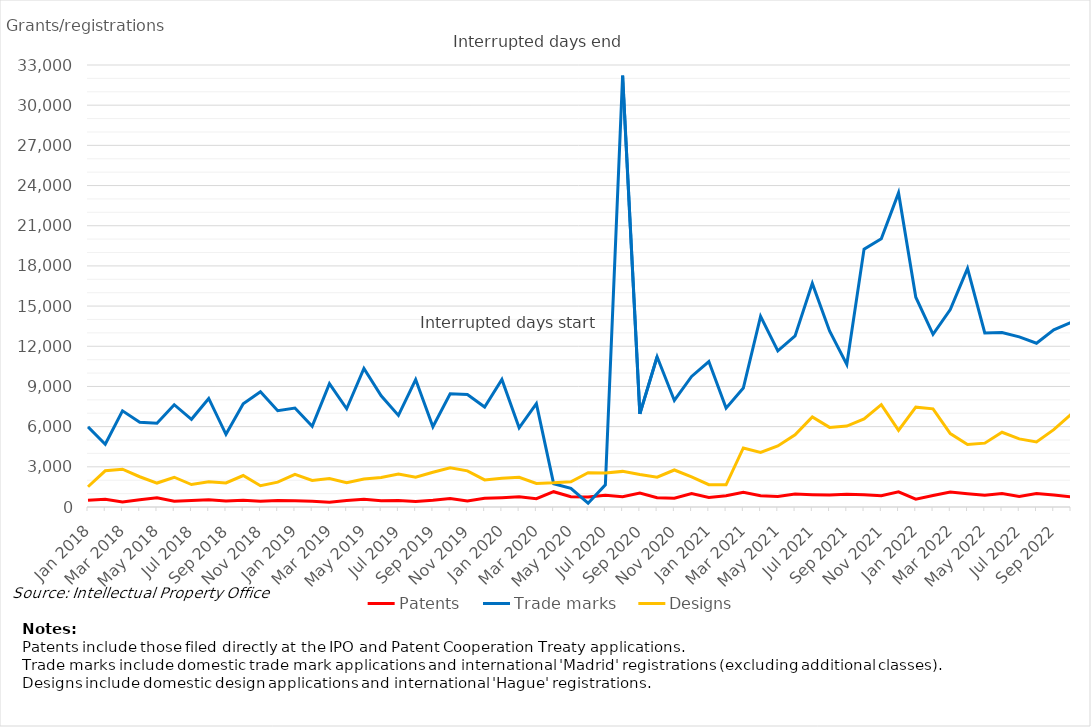
| Category | Patents | Trade marks | Designs |
|---|---|---|---|
| Jan 2018 | 495 | 5979 | 1512 |
| Feb 2018 | 574 | 4687 | 2704 |
| Mar 2018 | 370 | 7178 | 2825 |
| Apr 2018 | 543 | 6334 | 2259 |
| May 2018 | 690 | 6253 | 1789 |
| Jun 2018 | 424 | 7637 | 2222 |
| Jul 2018 | 486 | 6549 | 1678 |
| Aug 2018 | 536 | 8104 | 1878 |
| Sep 2018 | 450 | 5429 | 1795 |
| Oct 2018 | 498 | 7701 | 2348 |
| Nov 2018 | 432 | 8604 | 1592 |
| Dec 2018 | 484 | 7190 | 1859 |
| Jan 2019 | 474 | 7392 | 2444 |
| Feb 2019 | 426 | 6023 | 1987 |
| Mar 2019 | 363 | 9208 | 2125 |
| Apr 2019 | 488 | 7336 | 1810 |
| May 2019 | 573 | 10344 | 2096 |
| Jun 2019 | 471 | 8304 | 2202 |
| Jul 2019 | 489 | 6840 | 2464 |
| Aug 2019 | 420 | 9518 | 2218 |
| Sep 2019 | 500 | 5992 | 2596 |
| Oct 2019 | 634 | 8460 | 2926 |
| Nov 2019 | 455 | 8403 | 2700 |
| Dec 2019 | 654 | 7465 | 2021 |
| Jan 2020 | 696 | 9525 | 2145 |
| Feb 2020 | 756 | 5909 | 2220 |
| Mar 2020 | 622 | 7722 | 1757 |
| Apr 2020 | 1143 | 1742 | 1803 |
| May 2020 | 768 | 1399 | 1888 |
| Jun 2020 | 740 | 280 | 2564 |
| Jul 2020 | 878 | 1659 | 2539 |
| Aug 2020 | 771 | 32204 | 2659 |
| Sep 2020 | 1042 | 6949 | 2425 |
| Oct 2020 | 697 | 11220 | 2223 |
| Nov 2020 | 649 | 7955 | 2763 |
| Dec 2020 | 1010 | 9749 | 2252 |
| Jan 2021 | 708 | 10856 | 1665 |
| Feb 2021 | 838 | 7381 | 1660 |
| Mar 2021 | 1107 | 8878 | 4408 |
| Apr 2021 | 838 | 14232 | 4074 |
| May 2021 | 788 | 11655 | 4562 |
| Jun 2021 | 972 | 12773 | 5385 |
| Jul 2021 | 918 | 16695 | 6731 |
| Aug 2021 | 887 | 13147 | 5944 |
| Sep 2021 | 947 | 10650 | 6041 |
| Oct 2021 | 920 | 19252 | 6577 |
| Nov 2021 | 841 | 20030 | 7642 |
| Dec 2021 | 1131 | 23452 | 5719 |
| Jan 2022 | 585 | 15663 | 7455 |
| Feb 2022 | 860 | 12897 | 7329 |
| Mar 2022 | 1111 | 14745 | 5482 |
| Apr 2022 | 990 | 17819 | 4663 |
| May 2022 | 883 | 12994 | 4767 |
| Jun 2022 | 1010 | 13033 | 5579 |
| Jul 2022 | 788 | 12702 | 5083 |
| Aug 2022 | 1007 | 12230 | 4856 |
| Sep 2022 | 889 | 13223 | 5777 |
| Oct 2022 | 758 | 13773 | 6911 |